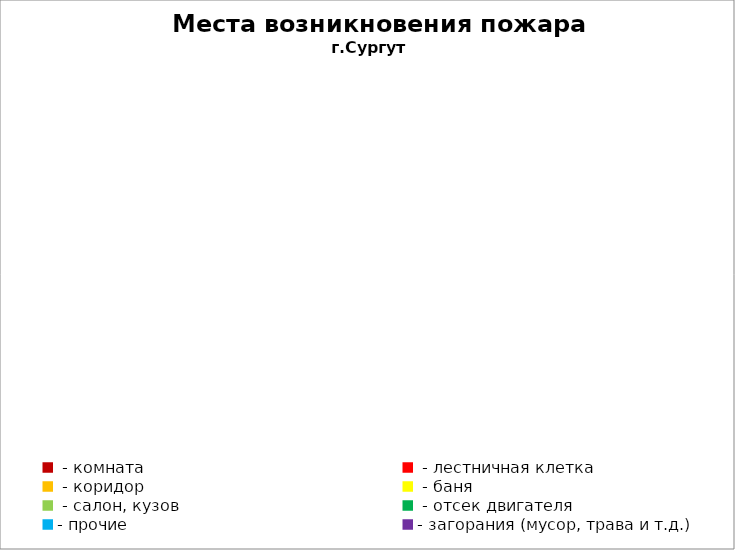
| Category | Места возникновения пожара |
|---|---|
|  - комната | 62 |
|  - лестничная клетка | 27 |
|  - коридор | 12 |
|  - баня | 30 |
|  - салон, кузов | 14 |
|  - отсек двигателя | 51 |
| - прочие | 177 |
| - загорания (мусор, трава и т.д.)  | 180 |